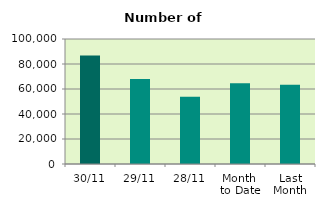
| Category | Series 0 |
|---|---|
| 30/11 | 86856 |
| 29/11 | 67914 |
| 28/11 | 53716 |
| Month 
to Date | 64659.273 |
| Last
Month | 63348.667 |